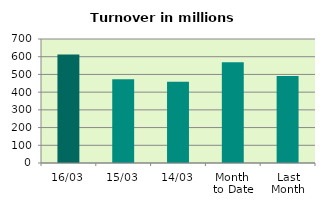
| Category | Series 0 |
|---|---|
| 16/03 | 612.47 |
| 15/03 | 472.749 |
| 14/03 | 458.837 |
| Month 
to Date | 569.431 |
| Last
Month | 490.433 |